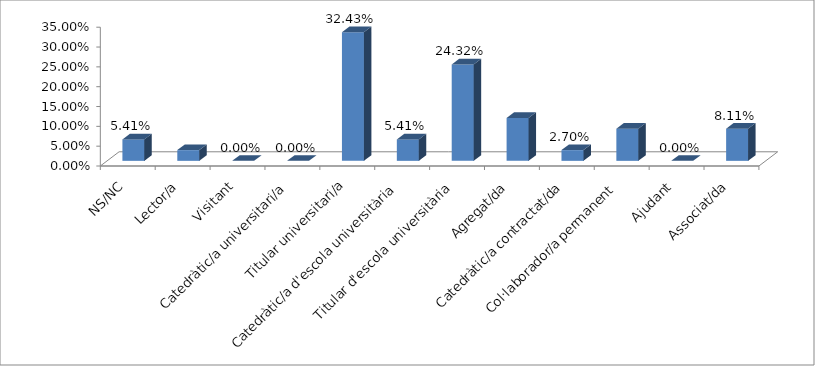
| Category | Series 0 |
|---|---|
| NS/NC | 0.054 |
| Lector/a | 0.027 |
| Visitant | 0 |
| Catedràtic/a universitari/a | 0 |
| Titular universitari/a | 0.324 |
| Catedràtic/a d'escola universitària | 0.054 |
| Titular d'escola universitària | 0.243 |
| Agregat/da | 0.108 |
| Catedràtic/a contractat/da | 0.027 |
| Col·laborador/a permanent | 0.081 |
| Ajudant | 0 |
| Associat/da | 0.081 |